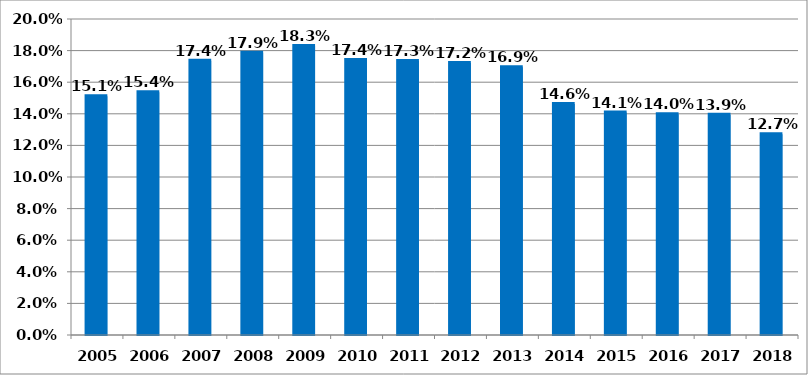
| Category | უმუშევრობა სულ |
|---|---|
| 2005.0 | 0.151 |
| 2006.0 | 0.154 |
| 2007.0 | 0.174 |
| 2008.0 | 0.179 |
| 2009.0 | 0.183 |
| 2010.0 | 0.174 |
| 2011.0 | 0.173 |
| 2012.0 | 0.172 |
| 2013.0 | 0.169 |
| 2014.0 | 0.146 |
| 2015.0 | 0.141 |
| 2016.0 | 0.14 |
| 2017.0 | 0.139 |
| 2018.0 | 0.127 |